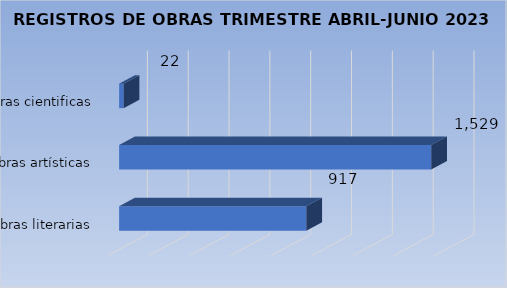
| Category | Cantidad |
|---|---|
| Obras literarias | 917 |
| Obras artísticas | 1529 |
| Obras cientificas | 22 |